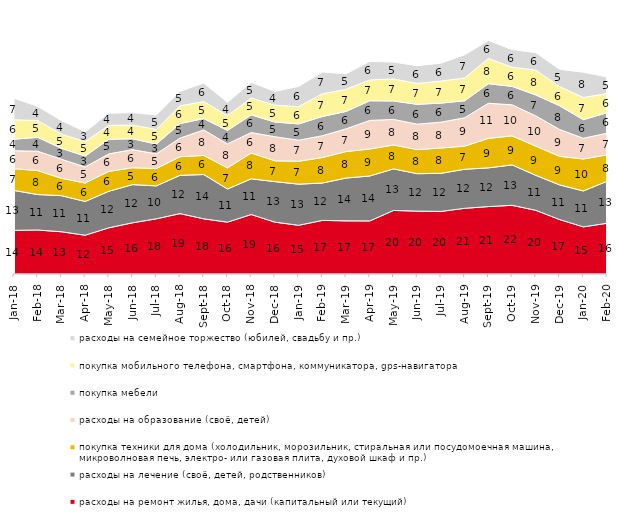
| Category | расходы на ремонт жилья, дома, дачи (капитальный или текущий) | расходы на лечение (своё, детей, родственников) | покупка техники для дома (холодильник, морозильник, стиральная или посудомоечная машина, микроволновая печь, электро- или газовая плита, духовой шкаф и пр.) | расходы на образование (своё, детей) | покупка мебели | покупка мобильного телефона, смартфона, коммуникатора, gps-навигатора | расходы на семейное торжество (юбилей, свадьбу и пр.) |
|---|---|---|---|---|---|---|---|
| 2018-01-01 | 13.85 | 12.65 | 6.9 | 5.7 | 3.65 | 6.15 | 6.85 |
| 2018-02-01 | 13.95 | 11.25 | 7.6 | 6.15 | 4.4 | 5.35 | 4.45 |
| 2018-03-01 | 13.4 | 11.45 | 5.5 | 6.05 | 3.45 | 4.5 | 4.3 |
| 2018-04-01 | 12.3 | 10.7 | 5.85 | 5.1 | 3.45 | 4.6 | 3.1 |
| 2018-05-01 | 14.65 | 11.6 | 6.3 | 5.55 | 4.65 | 4.4 | 3.8 |
| 2018-06-01 | 16.25 | 12.1 | 5.35 | 5.75 | 3.45 | 4.35 | 3.95 |
| 2018-07-01 | 17.5 | 10.45 | 5.5 | 4.65 | 3.1 | 4.65 | 4.55 |
| 2018-08-01 | 19.15 | 12.15 | 5.9 | 5.9 | 4.6 | 5.65 | 4.6 |
| 2018-09-01 | 17.5 | 14.05 | 6.05 | 8.1 | 3.6 | 5.4 | 5.85 |
| 2018-10-01 | 16.45 | 10.5 | 6.7 | 7.6 | 4.3 | 4.65 | 4.25 |
| 2018-11-01 | 18.862 | 11.327 | 8.184 | 6.487 | 5.589 | 5.389 | 4.94 |
| 2018-12-01 | 16.45 | 12.85 | 6.6 | 7.65 | 4.65 | 5.35 | 4.35 |
| 2019-01-01 | 15.45 | 13.05 | 7.25 | 6.7 | 5.15 | 5.5 | 6.4 |
| 2019-02-01 | 17 | 11.85 | 8.1 | 6.9 | 6.1 | 7.2 | 6.9 |
| 2019-03-01 | 16.857 | 13.575 | 8.404 | 7.21 | 5.52 | 7.011 | 4.923 |
| 2019-04-01 | 16.832 | 14.257 | 8.564 | 9.059 | 6.238 | 6.584 | 5.891 |
| 2019-05-01 | 20.158 | 13.175 | 7.578 | 8.123 | 5.844 | 6.984 | 5.349 |
| 2019-06-01 | 19.95 | 11.87 | 7.631 | 8.08 | 6.284 | 6.633 | 5.586 |
| 2019-07-01 | 19.851 | 12.079 | 8.02 | 8.218 | 6.04 | 6.98 | 5.693 |
| 2019-08-01 | 20.829 | 12.388 | 7.343 | 8.991 | 5.395 | 7.243 | 7.343 |
| 2019-09-01 | 21.386 | 12.277 | 9.356 | 11.139 | 6.188 | 8.02 | 5.693 |
| 2019-10-01 | 21.782 | 12.822 | 9.208 | 9.851 | 5.842 | 6.089 | 5.594 |
| 2019-11-01 | 20.198 | 11.089 | 9.257 | 9.604 | 6.634 | 7.871 | 5.545 |
| 2019-12-01 | 17.277 | 10.99 | 9.059 | 8.515 | 7.525 | 6.089 | 5.446 |
| 2020-01-01 | 14.95 | 11.386 | 10.149 | 6.584 | 5.891 | 7.03 | 8.02 |
| 2020-02-01 | 16.089 | 13.317 | 8.366 | 6.881 | 6.485 | 6.089 | 5.248 |